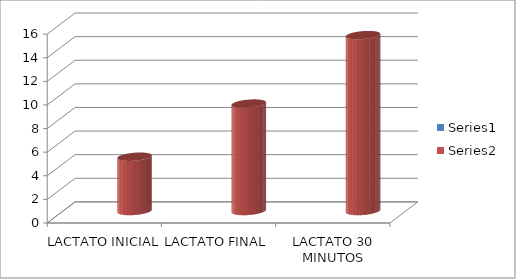
| Category | Series 0 | Series 1 | FC+Hoja1!$B$19:$B$29 |
|---|---|---|---|
| LACTATO INICIAL |  | 4.6 |  |
| LACTATO FINAL |  | 9.1 |  |
| LACTATO 30 MINUTOS |  | 14.9 |  |